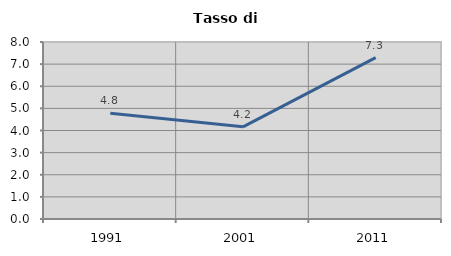
| Category | Tasso di disoccupazione   |
|---|---|
| 1991.0 | 4.777 |
| 2001.0 | 4.167 |
| 2011.0 | 7.295 |